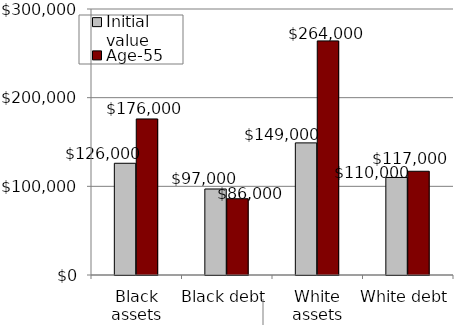
| Category | Initial value | Age-55 value |
|---|---|---|
| Black assets | 126000 | 176000 |
| Black debt | 97000 | 86000 |
| White assets | 149000 | 264000 |
| White debt | 110000 | 117000 |